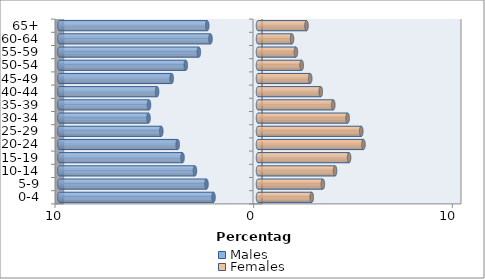
| Category | Males | Females |
|---|---|---|
| 0-4 | -2.24 | 2.705 |
| 5-9 | -2.592 | 3.265 |
| 10-14 | -3.174 | 3.88 |
| 15-19 | -3.8 | 4.585 |
| 20-24 | -4.043 | 5.309 |
| 25-29 | -4.869 | 5.199 |
| 30-34 | -5.512 | 4.512 |
| 35-39 | -5.487 | 3.789 |
| 40-44 | -5.079 | 3.16 |
| 45-49 | -4.345 | 2.629 |
| 50-54 | -3.636 | 2.2 |
| 55-59 | -2.978 | 1.909 |
| 60-64 | -2.392 | 1.713 |
| 65+ | -2.556 | 2.443 |